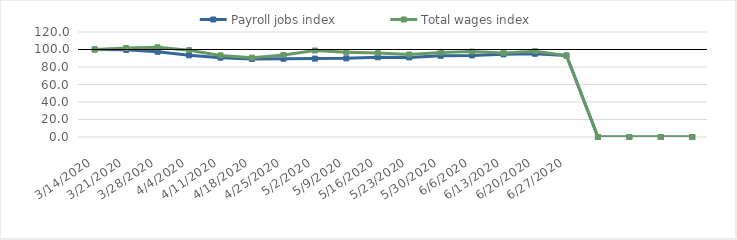
| Category | Payroll jobs index | Total wages index |
|---|---|---|
| 14/03/2020 | 100 | 100 |
| 21/03/2020 | 99.596 | 101.742 |
| 28/03/2020 | 97.414 | 102.541 |
| 04/04/2020 | 93.34 | 99.237 |
| 11/04/2020 | 90.71 | 93.273 |
| 18/04/2020 | 89.22 | 90.701 |
| 25/04/2020 | 89.471 | 93.718 |
| 02/05/2020 | 89.603 | 98.85 |
| 09/05/2020 | 89.869 | 96.992 |
| 16/05/2020 | 91.092 | 95.886 |
| 23/05/2020 | 90.964 | 94.297 |
| 30/05/2020 | 92.837 | 96.433 |
| 06/06/2020 | 93.204 | 97.611 |
| 13/06/2020 | 94.453 | 96.143 |
| 20/06/2020 | 95.101 | 98.065 |
| 27/06/2020 | 93.078 | 93.081 |